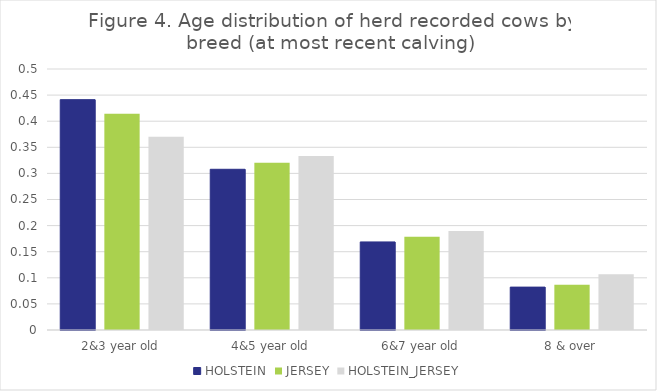
| Category | HOLSTEIN | JERSEY | HOLSTEIN_JERSEY |
|---|---|---|---|
| 2&3 year old | 0.441 | 0.414 | 0.37 |
| 4&5 year old | 0.308 | 0.32 | 0.333 |
| 6&7 year old | 0.169 | 0.179 | 0.19 |
| 8 & over | 0.082 | 0.087 | 0.107 |